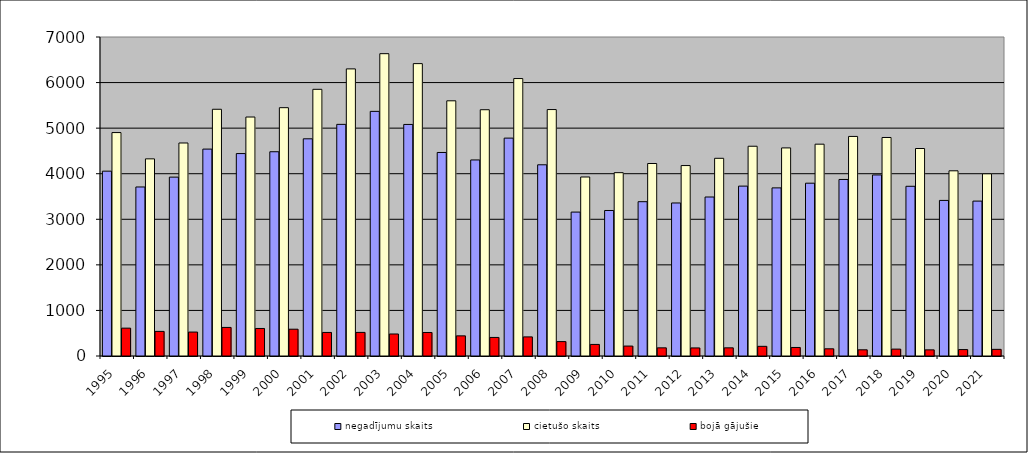
| Category | negadījumu skaits | cietušo skaits | bojā gājušie |
|---|---|---|---|
| 1995.0 | 4056 | 4903 | 611 |
| 1996.0 | 3709 | 4326 | 540 |
| 1997.0 | 3925 | 4674 | 525 |
| 1998.0 | 4540 | 5414 | 627 |
| 1999.0 | 4442 | 5244 | 604 |
| 2000.0 | 4482 | 5449 | 588 |
| 2001.0 | 4766 | 5852 | 517 |
| 2002.0 | 5083 | 6300 | 518 |
| 2003.0 | 5368 | 6634 | 483 |
| 2004.0 | 5081 | 6416 | 516 |
| 2005.0 | 4466 | 5600 | 442 |
| 2006.0 | 4302 | 5404 | 407 |
| 2007.0 | 4781 | 6088 | 419 |
| 2008.0 | 4196 | 5408 | 316 |
| 2009.0 | 3158 | 3928 | 254 |
| 2010.0 | 3193 | 4023 | 218 |
| 2011.0 | 3386 | 4224 | 179 |
| 2012.0 | 3358 | 4179 | 177 |
| 2013.0 | 3489 | 4338 | 179 |
| 2014.0 | 3728 | 4603 | 212 |
| 2015.0 | 3689 | 4566 | 187 |
| 2016.0 | 3792 | 4648 | 158 |
| 2017.0 | 3874 | 4818 | 136 |
| 2018.0 | 3973 | 4795 | 151 |
| 2019.0 | 3724 | 4553 | 135 |
| 2020.0 | 3414 | 4064 | 141 |
| 2021.0 | 3399 | 3998 | 146 |